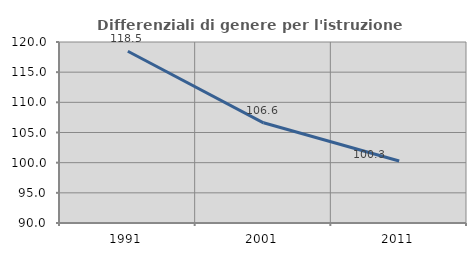
| Category | Differenziali di genere per l'istruzione superiore |
|---|---|
| 1991.0 | 118.466 |
| 2001.0 | 106.605 |
| 2011.0 | 100.272 |